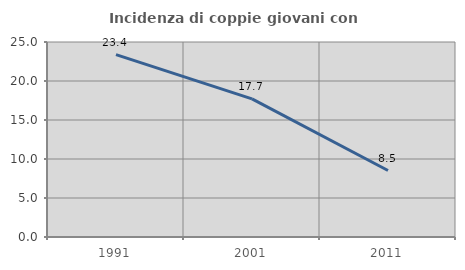
| Category | Incidenza di coppie giovani con figli |
|---|---|
| 1991.0 | 23.379 |
| 2001.0 | 17.709 |
| 2011.0 | 8.525 |